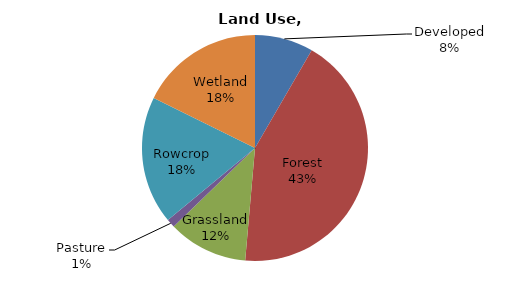
| Category | Series 0 |
|---|---|
| Developed | 179.264 |
| Forest | 921.598 |
| Grassland | 244.208 |
| Pasture | 26.162 |
| Rowcrop | 392.21 |
| Wetland | 378.883 |